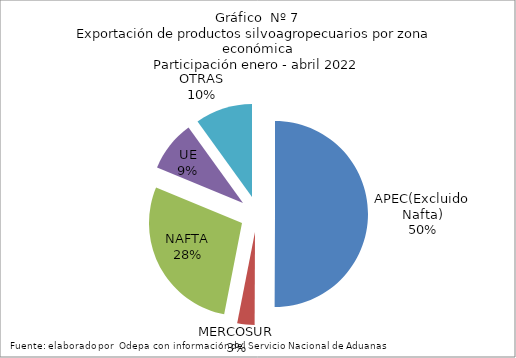
| Category | Series 0 |
|---|---|
| APEC(Excluido Nafta) | 3581250.149 |
| MERCOSUR | 214858.883 |
| NAFTA | 2015031.82 |
| UE | 629549.419 |
| OTRAS | 712250.729 |